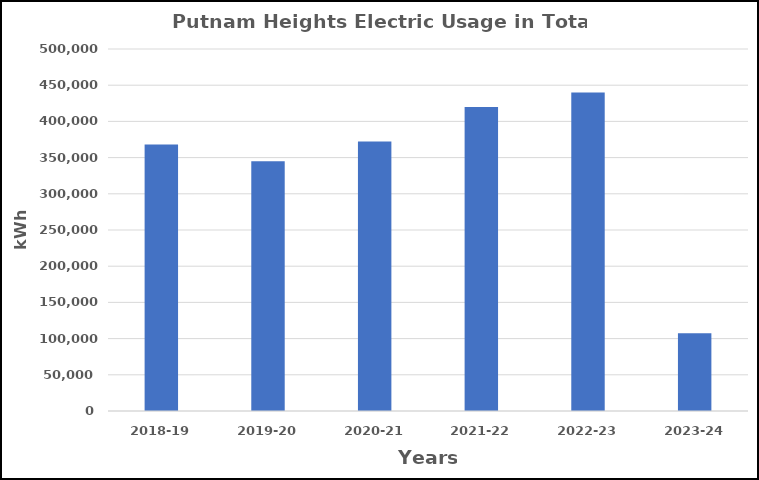
| Category | Series 0 |
|---|---|
| 2018-19 | 368170 |
| 2019-20 | 344806 |
| 2020-21 | 372318 |
| 2021-22 | 419859 |
| 2022-23 | 439960 |
| 2023-24 | 107534 |